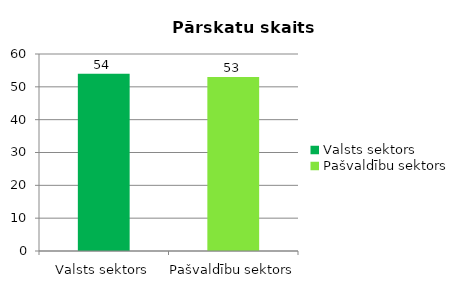
| Category |  Pārskatu skaits |
|---|---|
| Valsts sektors | 54 |
| Pašvaldību sektors | 53 |